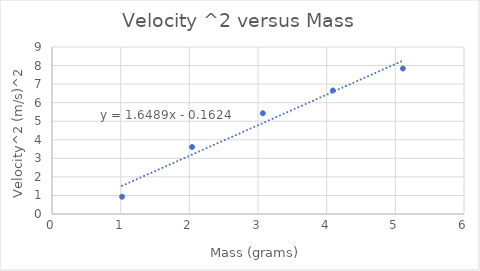
| Category | Series 0 |
|---|---|
| 1.02 | 0.93 |
| 2.04 | 3.61 |
| 3.07 | 5.429 |
| 4.09 | 6.656 |
| 5.11 | 7.84 |